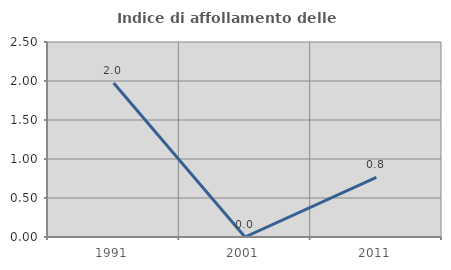
| Category | Indice di affollamento delle abitazioni  |
|---|---|
| 1991.0 | 1.974 |
| 2001.0 | 0 |
| 2011.0 | 0.763 |